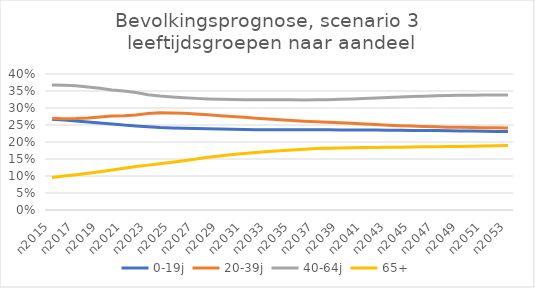
| Category | 0-19j | 20-39j | 40-64j | 65+ |
|---|---|---|---|---|
| n2015 | 0.267 | 0.27 | 0.368 | 0.096 |
| n2016 | 0.265 | 0.268 | 0.367 | 0.1 |
| n2017 | 0.262 | 0.269 | 0.365 | 0.104 |
| n2018 | 0.259 | 0.271 | 0.362 | 0.108 |
| n2019 | 0.256 | 0.274 | 0.358 | 0.113 |
| n2020 | 0.253 | 0.276 | 0.353 | 0.118 |
| n2021 | 0.25 | 0.277 | 0.35 | 0.123 |
| n2022 | 0.247 | 0.279 | 0.346 | 0.128 |
| n2023 | 0.245 | 0.284 | 0.339 | 0.132 |
| n2024 | 0.242 | 0.286 | 0.335 | 0.136 |
| n2025 | 0.241 | 0.286 | 0.333 | 0.141 |
| n2026 | 0.24 | 0.284 | 0.33 | 0.145 |
| n2027 | 0.239 | 0.282 | 0.328 | 0.15 |
| n2028 | 0.239 | 0.28 | 0.327 | 0.155 |
| n2029 | 0.238 | 0.277 | 0.326 | 0.159 |
| n2030 | 0.237 | 0.275 | 0.325 | 0.163 |
| n2031 | 0.237 | 0.273 | 0.324 | 0.166 |
| n2032 | 0.236 | 0.27 | 0.324 | 0.169 |
| n2033 | 0.236 | 0.268 | 0.324 | 0.172 |
| n2034 | 0.236 | 0.265 | 0.325 | 0.174 |
| n2035 | 0.236 | 0.263 | 0.324 | 0.177 |
| n2036 | 0.236 | 0.261 | 0.324 | 0.179 |
| n2037 | 0.236 | 0.26 | 0.324 | 0.181 |
| n2038 | 0.236 | 0.258 | 0.324 | 0.182 |
| n2039 | 0.236 | 0.256 | 0.325 | 0.183 |
| n2040 | 0.235 | 0.255 | 0.326 | 0.183 |
| n2041 | 0.235 | 0.253 | 0.328 | 0.184 |
| n2042 | 0.235 | 0.251 | 0.33 | 0.184 |
| n2043 | 0.235 | 0.249 | 0.331 | 0.185 |
| n2044 | 0.234 | 0.248 | 0.333 | 0.185 |
| n2045 | 0.234 | 0.247 | 0.334 | 0.185 |
| n2046 | 0.234 | 0.246 | 0.335 | 0.186 |
| n2047 | 0.234 | 0.245 | 0.336 | 0.186 |
| n2048 | 0.233 | 0.244 | 0.337 | 0.186 |
| n2049 | 0.233 | 0.243 | 0.337 | 0.187 |
| n2050 | 0.232 | 0.243 | 0.338 | 0.188 |
| n2051 | 0.232 | 0.242 | 0.338 | 0.188 |
| n2052 | 0.231 | 0.242 | 0.338 | 0.189 |
| n2053 | 0.231 | 0.241 | 0.338 | 0.19 |